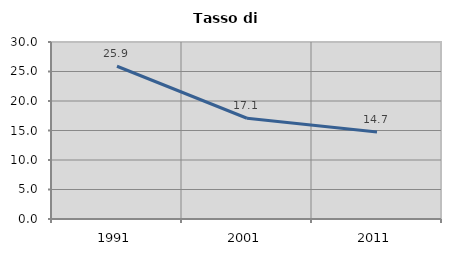
| Category | Tasso di disoccupazione   |
|---|---|
| 1991.0 | 25.892 |
| 2001.0 | 17.075 |
| 2011.0 | 14.729 |